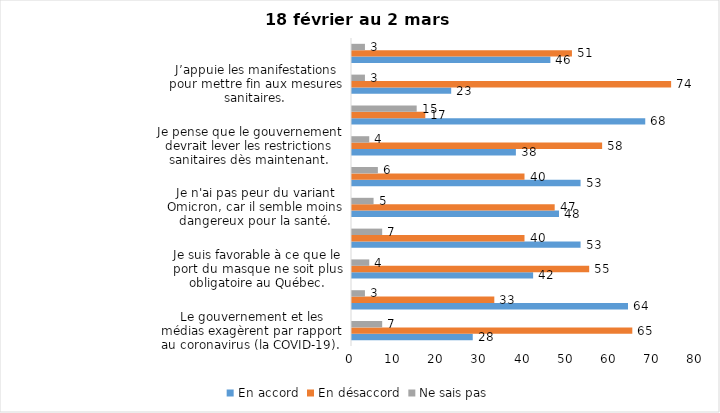
| Category | En accord | En désaccord | Ne sais pas |
|---|---|---|---|
| Le gouvernement et les médias exagèrent par rapport au coronavirus (la COVID-19). | 28 | 65 | 7 |
| Malgré la levée des mesures de confinement, je préfère limiter mes contacts avec d’autres personnes (par ex., en évitant les activités sociales et de groupes) | 64 | 33 | 3 |
| Je suis favorable à ce que le port du masque ne soit plus obligatoire au Québec. | 42 | 55 | 4 |
| Je pense que le gouvernement du Québec devrait mettre fin à l’état d’urgence sanitaire.  | 53 | 40 | 7 |
| Je n'ai pas peur du variant Omicron, car il semble moins dangereux pour la santé. | 48 | 47 | 5 |
| La vaccination obligatoire contre la COVID-19 mettrait fin à la pandémie. | 53 | 40 | 6 |
| Je pense que le gouvernement devrait lever les restrictions sanitaires dès maintenant. | 38 | 58 | 4 |
| Si moi ou mon enfant passons un test de dépistage rapide, je remplirai le formulaire de déclaration sur le site web du Gouvernement du Québec. | 68 | 17 | 15 |
| J’appuie les manifestations pour mettre fin aux mesures sanitaires. | 23 | 74 | 3 |
| Je suis favorable au retrait du passeport vaccinal | 46 | 51 | 3 |